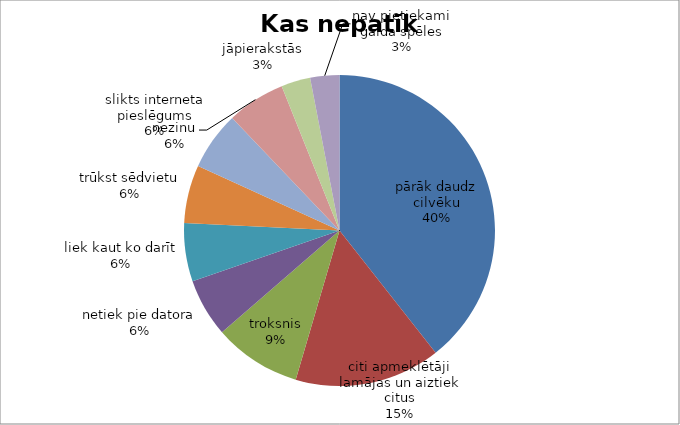
| Category | Kas nepatīk BJC? |
|---|---|
| pārāk daudz cilvēku | 13 |
| citi apmeklētāji lamājas un aiztiek citus | 5 |
| troksnis | 3 |
| netiek pie datora | 2 |
| liek kaut ko darīt | 2 |
| trūkst sēdvietu | 2 |
| slikts interneta pieslēgums | 2 |
| nezinu | 2 |
| jāpierakstās | 1 |
| nav pietiekami galda spēles | 1 |